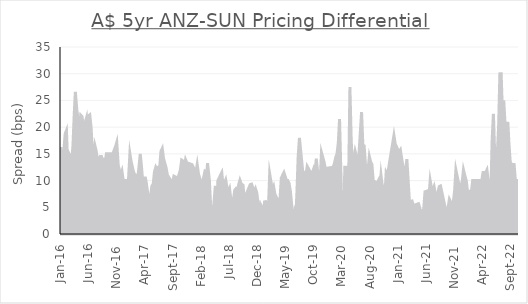
| Category | Diff. |
|---|---|
| 2022-10-13 | 10 |
| 2022-10-06 | 10 |
| 2022-09-29 | 10 |
| 2022-09-22 | 13 |
| 2022-09-15 | 13 |
| 2022-09-08 | 13 |
| 2022-09-01 | 13.5 |
| 2022-08-25 | 17 |
| 2022-08-19 | 21 |
| 2022-08-12 | 14 |
| 2022-08-05 | 20 |
| 2022-07-28 | 25 |
| 2022-07-21 | 22.5 |
| 2022-07-14 | 30 |
| 2022-07-07 | 30 |
| 2022-06-30 | 20 |
| 2022-06-23 | 15 |
| 2022-06-16 | 15 |
| 2022-06-09 | 15 |
| 2022-06-02 | 22.5 |
| 2022-05-26 | 17.5 |
| 2022-05-19 | 7.5 |
| 2022-05-12 | 10 |
| 2022-05-05 | 10 |
| 2022-04-28 | 12 |
| 2022-04-21 | 11.5 |
| 2022-04-13 | 11.5 |
| 2022-04-07 | 11.5 |
| 2022-03-31 | 10 |
| 2022-03-24 | 10 |
| 2022-03-17 | 10 |
| 2022-03-10 | 10 |
| 2022-03-03 | 10 |
| 2022-02-24 | 10 |
| 2022-02-17 | 10 |
| 2022-02-10 | 10 |
| 2022-02-03 | 8 |
| 2022-01-20 | 8 |
| 2022-01-13 | 8 |
| 2022-01-06 | 10 |
| 2021-12-29 | 11 |
| 2021-12-22 | 12 |
| 2021-12-16 | 10 |
| 2021-12-09 | 9 |
| 2021-12-02 | 8.5 |
| 2021-11-11 | 12 |
| 2021-11-04 | 8 |
| 2021-10-28 | 6 |
| 2021-10-21 | 4 |
| 2021-10-14 | 6 |
| 2021-10-07 | 6.5 |
| 2021-09-30 | 5 |
| 2021-09-23 | 3.5 |
| 2021-08-20 | 9 |
| 2021-08-13 | 8.875 |
| 2021-08-06 | 7.75 |
| 2021-07-30 | 6.625 |
| 2021-07-23 | 7.5 |
| 2021-07-16 | 8.875 |
| 2021-07-09 | 8.25 |
| 2021-07-02 | 8.625 |
| 2021-06-25 | 10 |
| 2021-06-21 | 8.2 |
| 2021-05-28 | 7.9 |
| 2021-05-21 | 4.6 |
| 2021-05-14 | 4.3 |
| 2021-05-07 | 4 |
| 2021-04-30 | 4.833 |
| 2021-04-23 | 5.667 |
| 2021-04-09 | 5.5 |
| 2021-03-26 | 5.333 |
| 2021-03-19 | 6.167 |
| 2021-03-05 | 6 |
| 2021-02-19 | 14 |
| 2021-02-12 | 12 |
| 2021-02-05 | 10 |
| 2021-01-29 | 12.571 |
| 2021-01-22 | 14.143 |
| 2021-01-15 | 15.714 |
| 2021-01-08 | 15.286 |
| 2020-12-18 | 16.857 |
| 2020-12-11 | 18.429 |
| 2020-11-06 | 11 |
| 2020-10-30 | 11.5 |
| 2020-10-23 | 7 |
| 2020-10-16 | 9 |
| 2020-10-09 | 9 |
| 2020-10-02 | 11 |
| 2020-09-25 | 8 |
| 2020-09-18 | 10 |
| 2020-09-11 | 9.5 |
| 2020-08-21 | 10 |
| 2020-08-14 | 13 |
| 2020-08-07 | 13.5 |
| 2020-07-31 | 14.5 |
| 2020-07-24 | 12 |
| 2020-07-17 | 11.5 |
| 2020-07-10 | 13 |
| 2020-07-03 | 16.5 |
| 2020-06-26 | 16.667 |
| 2020-06-19 | 22.833 |
| 2020-06-05 | 15 |
| 2020-05-29 | 13.5 |
| 2020-05-22 | 14.5 |
| 2020-05-15 | 15.5 |
| 2020-05-08 | 14 |
| 2020-05-01 | 12.5 |
| 2020-04-24 | 17.5 |
| 2020-04-17 | 27.5 |
| 2020-04-09 | 7.5 |
| 2020-04-03 | 2.5 |
| 2020-03-27 | 12.5 |
| 2020-03-20 | 12.5 |
| 2020-03-16 | 2.5 |
| 2020-03-06 | 6.5 |
| 2020-03-03 | 6 |
| 2020-02-21 | 21.5 |
| 2020-02-14 | 17 |
| 2020-02-07 | 15 |
| 2020-01-31 | 14.333 |
| 2020-01-24 | 13.167 |
| 2020-01-17 | 12.5 |
| 2019-12-06 | 12.25 |
| 2019-11-29 | 13.5 |
| 2019-11-15 | 15.25 |
| 2019-11-08 | 10 |
| 2019-10-25 | 11.8 |
| 2019-10-18 | 14.1 |
| 2019-10-11 | 11.4 |
| 2019-10-04 | 12.2 |
| 2019-09-27 | 11.5 |
| 2019-09-20 | 11.333 |
| 2019-08-30 | 12.667 |
| 2019-08-23 | 11 |
| 2019-08-16 | 11.333 |
| 2019-08-09 | 10.667 |
| 2019-08-02 | 13 |
| 2019-07-19 | 18 |
| 2019-07-12 | 14.5 |
| 2019-07-05 | 7.5 |
| 2019-06-28 | 2 |
| 2019-06-21 | 4 |
| 2019-06-14 | 3 |
| 2019-05-31 | 8 |
| 2019-05-24 | 9.5 |
| 2019-05-17 | 10 |
| 2019-05-10 | 10 |
| 2019-04-26 | 11.5 |
| 2019-04-12 | 10.5 |
| 2019-04-03 | 5.5 |
| 2019-03-08 | 7.5 |
| 2019-03-01 | 8.937 |
| 2019-02-22 | 8.375 |
| 2019-02-15 | 9.812 |
| 2019-02-08 | 11.25 |
| 2019-02-01 | 4.687 |
| 2019-01-25 | 5.625 |
| 2019-01-18 | 6.062 |
| 2019-01-11 | 6 |
| 2019-01-07 | 4.25 |
| 2018-12-21 | 5.5 |
| 2018-12-13 | 3.25 |
| 2018-12-03 | 7 |
| 2018-11-30 | 7.75 |
| 2018-11-23 | 8.5 |
| 2018-11-16 | 7.917 |
| 2018-11-02 | 9.333 |
| 2018-10-26 | 9.25 |
| 2018-10-19 | 8.667 |
| 2018-10-12 | 8.083 |
| 2018-10-05 | 7.5 |
| 2018-09-28 | 7.214 |
| 2018-09-21 | 7.429 |
| 2018-09-17 | 9.143 |
| 2018-09-07 | 9.357 |
| 2018-08-31 | 10.071 |
| 2018-08-17 | 8.286 |
| 2018-08-10 | 8.5 |
| 2018-08-03 | 8.2 |
| 2018-07-27 | 6.4 |
| 2018-07-20 | 6.1 |
| 2018-07-12 | 6.8 |
| 2018-07-06 | 8.5 |
| 2018-06-29 | 7.875 |
| 2018-06-22 | 8.75 |
| 2018-06-15 | 10.125 |
| 2018-06-08 | 9.5 |
| 2018-06-01 | 9 |
| 2018-05-25 | 11.5 |
| 2018-05-18 | 11 |
| 2018-05-11 | 10.5 |
| 2018-05-04 | 10 |
| 2018-04-27 | 5 |
| 2018-04-20 | 9 |
| 2018-04-06 | 3 |
| 2018-03-29 | 3 |
| 2018-03-19 | 10 |
| 2018-03-09 | 13.25 |
| 2018-03-05 | 11.5 |
| 2018-02-23 | 11.75 |
| 2018-02-12 | 10 |
| 2018-02-02 | 9.5 |
| 2018-01-19 | 11.25 |
| 2018-01-12 | 13 |
| 2018-01-05 | 11.5 |
| 2017-12-15 | 13 |
| 2017-12-08 | 13.083 |
| 2017-12-01 | 13.167 |
| 2017-11-24 | 12.25 |
| 2017-11-17 | 13.333 |
| 2017-11-10 | 13.917 |
| 2017-11-03 | 12.5 |
| 2017-10-27 | 13.667 |
| 2017-10-20 | 13.833 |
| 2017-10-13 | 12 |
| 2017-10-06 | 11.167 |
| 2017-09-29 | 10.333 |
| 2017-09-22 | 10.5 |
| 2017-09-18 | 10.667 |
| 2017-09-08 | 10.833 |
| 2017-09-01 | 9.5 |
| 2017-08-25 | 9.875 |
| 2017-08-18 | 10.25 |
| 2017-08-11 | 10.625 |
| 2017-08-04 | 11 |
| 2017-07-28 | 12.375 |
| 2017-07-21 | 13.25 |
| 2017-07-14 | 14.125 |
| 2017-07-07 | 16 |
| 2017-06-30 | 15.5 |
| 2017-06-23 | 12.5 |
| 2017-06-16 | 12.5 |
| 2017-06-09 | 12 |
| 2017-06-02 | 12.5 |
| 2017-05-26 | 11.667 |
| 2017-05-19 | 9.333 |
| 2017-05-12 | 9 |
| 2017-05-05 | 7.167 |
| 2017-04-28 | 5.833 |
| 2017-04-24 | 6.5 |
| 2017-04-12 | 9.5 |
| 2017-04-07 | 10.5 |
| 2017-03-31 | 10.5 |
| 2017-03-23 | 10 |
| 2017-03-17 | 12.5 |
| 2017-03-10 | 15 |
| 2017-03-03 | 12.5 |
| 2017-02-23 | 10 |
| 2017-02-17 | 11 |
| 2017-02-10 | 11 |
| 2017-02-03 | 11.5 |
| 2017-01-30 | 12 |
| 2017-01-20 | 13.5 |
| 2017-01-13 | 15 |
| 2017-01-05 | 10 |
| 2016-12-21 | 10 |
| 2016-12-15 | 10 |
| 2016-12-08 | 10 |
| 2016-12-01 | 11.786 |
| 2016-11-24 | 11.071 |
| 2016-11-11 | 12.857 |
| 2016-11-03 | 17.143 |
| 2016-10-28 | 16.429 |
| 2016-10-20 | 15.714 |
| 2016-10-13 | 15 |
| 2016-10-07 | 15 |
| 2016-09-29 | 15 |
| 2016-09-22 | 13.5 |
| 2016-09-15 | 15 |
| 2016-09-08 | 15 |
| 2016-09-01 | 13.375 |
| 2016-08-26 | 13.75 |
| 2016-08-19 | 13.125 |
| 2016-08-12 | 14.5 |
| 2016-08-05 | 14.5 |
| 2016-07-29 | 14 |
| 2016-07-22 | 13.5 |
| 2016-07-15 | 15.5 |
| 2016-07-08 | 16.5 |
| 2016-07-01 | 14 |
| 2016-06-29 | 12.5 |
| 2016-06-17 | 20 |
| 2016-06-10 | 22.3 |
| 2016-06-03 | 22.1 |
| 2016-05-26 | 19.9 |
| 2016-05-23 | 21.7 |
| 2016-05-13 | 20.5 |
| 2016-05-06 | 20.25 |
| 2016-04-29 | 22 |
| 2016-04-22 | 22.25 |
| 2016-04-15 | 19.5 |
| 2016-04-08 | 21.375 |
| 2016-04-01 | 23.25 |
| 2016-03-24 | 26.625 |
| 2016-03-18 | 22.5 |
| 2016-03-11 | 16.5 |
| 2016-03-04 | 13.5 |
| 2016-02-26 | 14.5 |
| 2016-02-19 | 15 |
| 2016-02-12 | 12.5 |
| 2016-02-05 | 19.375 |
| 2016-01-29 | 18.75 |
| 2016-01-22 | 15.625 |
| 2016-01-15 | 15 |
| 2016-01-08 | 14.375 |
| 2016-01-05 | 16.25 |